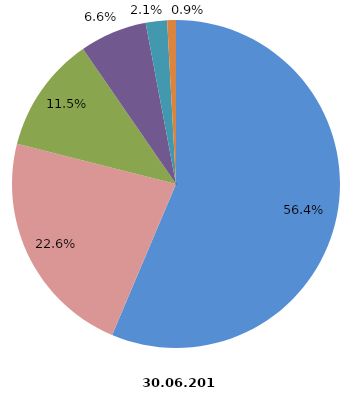
| Category | Anzahl Betriebe 2016 |
|---|---|
| 1 - 4 Beschäftigte | 1633 |
| 5 - 9 Beschäftigte | 654 |
| 10 - 19 Beschäftigte | 332 |
| 20 - 49 Beschäftigte | 192 |
| 50 - 99 Beschäftigte | 61 |
| 100 und mehr Beschäftigte | 25 |